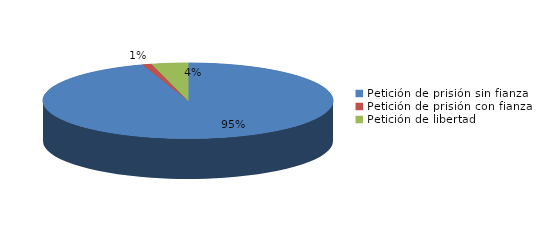
| Category | Series 0 |
|---|---|
| Petición de prisión sin fianza | 94 |
| Petición de prisión con fianza | 1 |
| Petición de libertad | 4 |